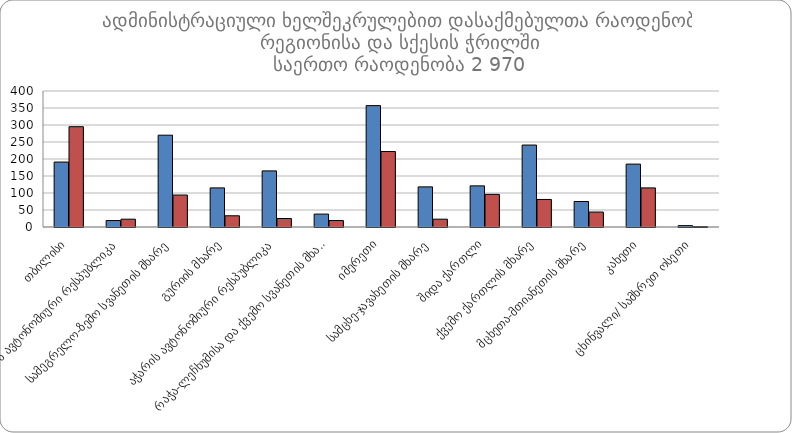
| Category |  მამრობითი |  მდედრობითი |
|---|---|---|
|  თბილისი | 191 | 295 |
|  აფხაზეთის ავტონომიური რესპუბლიკა | 19 | 23 |
|  სამეგრელო-ზემო სვანეთის მხარე | 270 | 94 |
|  გურიის მხარე | 115 | 33 |
|  აჭარის ავტონომიური რესპუბლიკა | 165 | 25 |
|  რაჭა-ლეჩხუმისა და ქვემო სვანეთის მხარე | 38 | 19 |
|  იმერეთი | 357 | 222 |
|  სამცხე-ჯავახეთის მხარე | 118 | 23 |
|  შიდა ქართლი | 121 | 96 |
|  ქვემო ქართლის მხარე | 241 | 81 |
|  მცხეთა-მთიანეთის მხარე | 75 | 44 |
|  კახეთი | 185 | 115 |
|  ცხინვალი/ სამხრეთ ოსეთი | 4 | 1 |